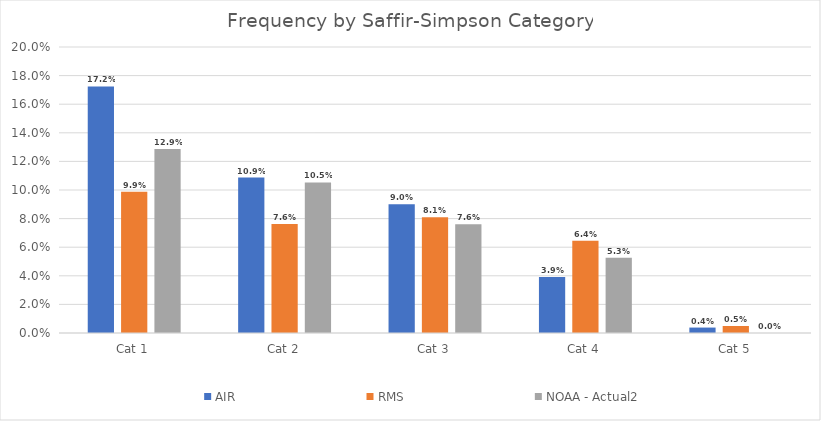
| Category | AIR | RMS | NOAA - Actual2 |
|---|---|---|---|
| Cat 1 | 0.172 | 0.099 | 0.129 |
| Cat 2 | 0.109 | 0.076 | 0.105 |
| Cat 3 | 0.09 | 0.081 | 0.076 |
| Cat 4 | 0.039 | 0.064 | 0.053 |
| Cat 5 | 0.004 | 0.005 | 0 |